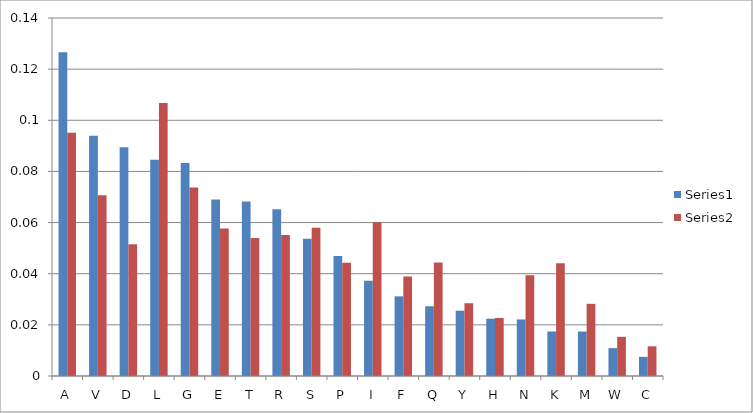
| Category | Series 0 | Series 1 |
|---|---|---|
| A | 0.127 | 0.095 |
| V | 0.094 | 0.071 |
| D | 0.089 | 0.051 |
| L | 0.085 | 0.107 |
| G | 0.083 | 0.074 |
| E | 0.069 | 0.058 |
| T | 0.068 | 0.054 |
| R | 0.065 | 0.055 |
| S | 0.054 | 0.058 |
| P | 0.047 | 0.044 |
| I | 0.037 | 0.06 |
| F | 0.031 | 0.039 |
| Q | 0.027 | 0.044 |
| Y | 0.026 | 0.028 |
| H | 0.022 | 0.023 |
| N | 0.022 | 0.039 |
| K | 0.017 | 0.044 |
| M | 0.017 | 0.028 |
| W | 0.011 | 0.015 |
| C | 0.007 | 0.012 |